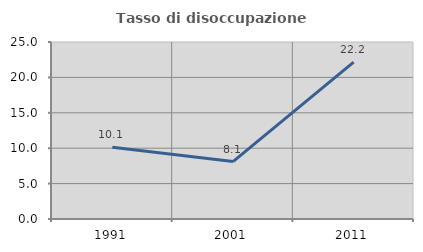
| Category | Tasso di disoccupazione giovanile  |
|---|---|
| 1991.0 | 10.149 |
| 2001.0 | 8.108 |
| 2011.0 | 22.152 |